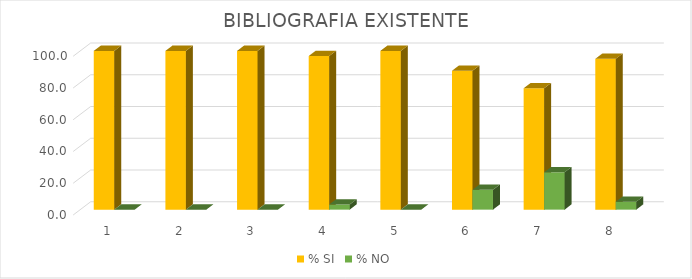
| Category | % SI | % NO |
|---|---|---|
| 0 | 100 | 0 |
| 1 | 100 | 0 |
| 2 | 100 | 0 |
| 3 | 96.774 | 3.226 |
| 4 | 100 | 0 |
| 5 | 87.5 | 12.5 |
| 6 | 76.471 | 23.529 |
| 7 | 95 | 5 |